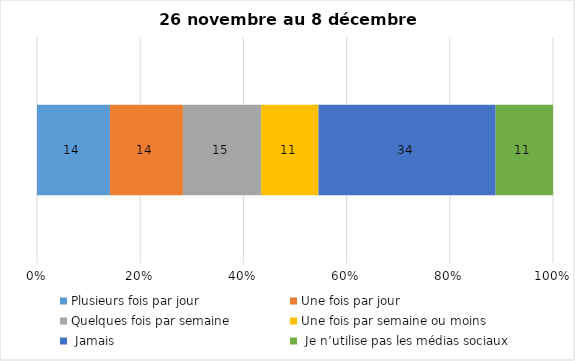
| Category | Plusieurs fois par jour | Une fois par jour | Quelques fois par semaine   | Une fois par semaine ou moins   |  Jamais   |  Je n’utilise pas les médias sociaux |
|---|---|---|---|---|---|---|
| 0 | 14 | 14 | 15 | 11 | 34 | 11 |